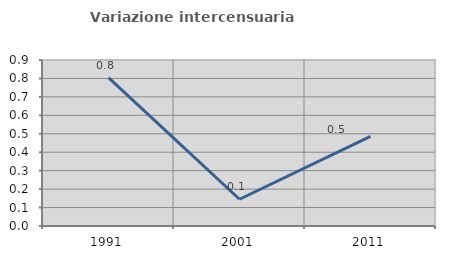
| Category | Variazione intercensuaria annua |
|---|---|
| 1991.0 | 0.804 |
| 2001.0 | 0.145 |
| 2011.0 | 0.486 |